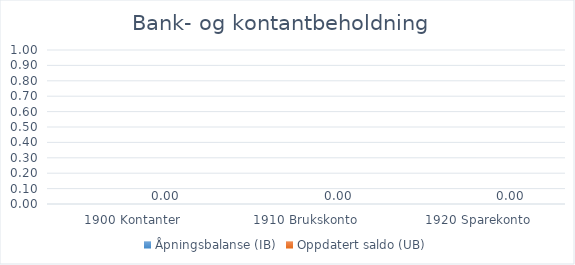
| Category | Åpningsbalanse (IB) | Oppdatert saldo (UB) |
|---|---|---|
| 1900 Kontanter |  | 0 |
| 1910 Brukskonto |  | 0 |
| 1920 Sparekonto |  | 0 |